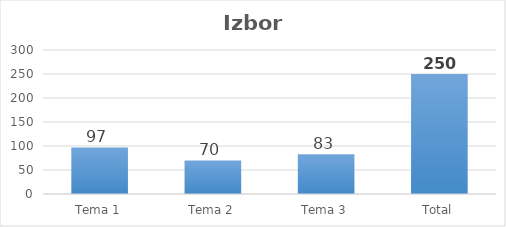
| Category | Series 0 |
|---|---|
| Tema 1 | 97 |
| Tema 2 | 70 |
| Tema 3 | 83 |
| Total | 250 |